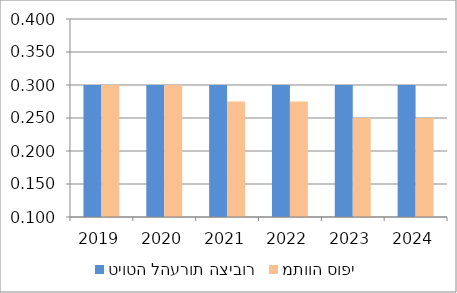
| Category | טיוטה להערות הציבור | מתווה סופי |
|---|---|---|
| 2019.0 | 0.3 | 0.3 |
| 2020.0 | 0.3 | 0.3 |
| 2021.0 | 0.3 | 0.275 |
| 2022.0 | 0.3 | 0.275 |
| 2023.0 | 0.3 | 0.25 |
| 2024.0 | 0.3 | 0.25 |